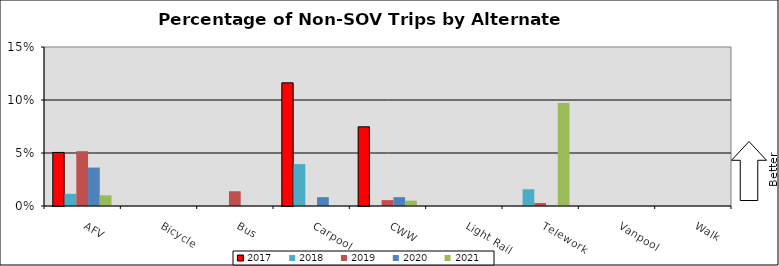
| Category | 2017 | 2018 | 2019 | 2020 | 2021 |
|---|---|---|---|---|---|
| AFV | 0.051 | 0.011 | 0.052 | 0.036 | 0.01 |
| Bicycle | 0 | 0 | 0 | 0 | 0 |
| Bus | 0 | 0 | 0.014 | 0 | 0 |
| Carpool | 0.116 | 0.04 | 0 | 0.008 | 0 |
| CWW | 0.075 | 0 | 0.006 | 0.008 | 0.005 |
| Light Rail | 0 | 0 | 0 | 0 | 0 |
| Telework | 0 | 0.016 | 0.003 | 0 | 0.097 |
| Vanpool | 0 | 0 | 0 | 0 | 0 |
| Walk | 0 | 0 | 0 | 0 | 0 |